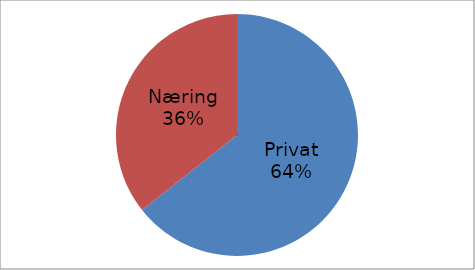
| Category | Series 0 |
|---|---|
| Privat | 35725223 |
| Næring | 19791426 |